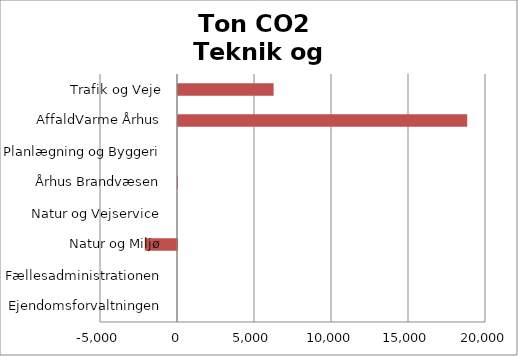
| Category | Series 0 | Series 1 |
|---|---|---|
| Ejendomsforvaltningen |  | 0 |
| Fællesadministrationen |  | 0 |
| Natur og Miljø |  | -2090.261 |
| Natur og Vejservice |  | 0 |
| Århus Brandvæsen |  | 0.061 |
| Planlægning og Byggeri |  | 0 |
| AffaldVarme Århus |  | 18778.618 |
| Trafik og Veje |  | 6208.786 |